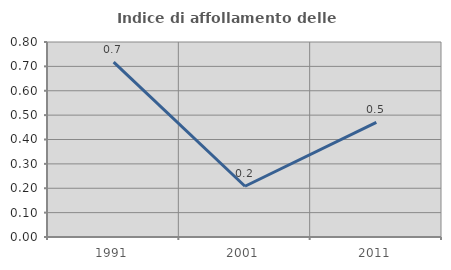
| Category | Indice di affollamento delle abitazioni  |
|---|---|
| 1991.0 | 0.718 |
| 2001.0 | 0.208 |
| 2011.0 | 0.47 |